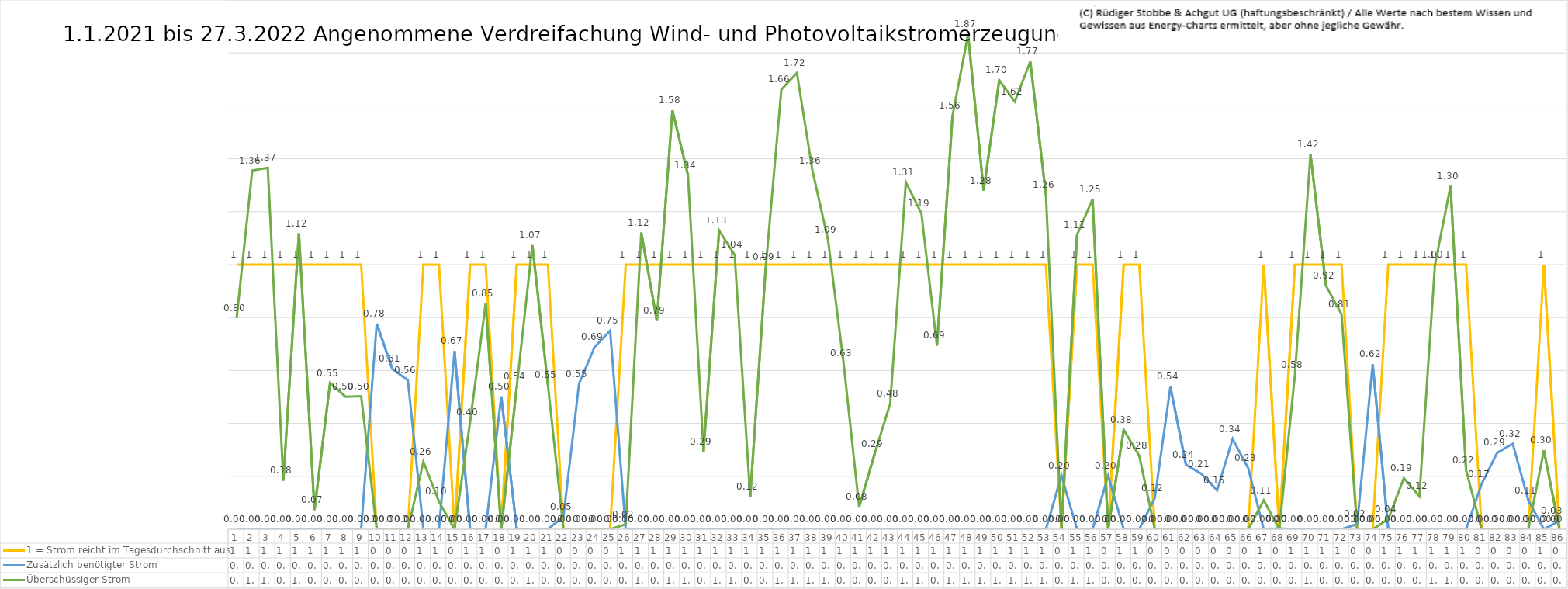
| Category | 1 = Strom reicht im Tagesdurchschnitt aus | Zusätzlich benötigter Strom | Überschüssiger Strom |
|---|---|---|---|
| 0 | 1 | 0 | 0.798 |
| 1 | 1 | 0 | 1.356 |
| 2 | 1 | 0 | 1.366 |
| 3 | 1 | 0 | 0.184 |
| 4 | 1 | 0 | 1.118 |
| 5 | 1 | 0 | 0.073 |
| 6 | 1 | 0 | 0.553 |
| 7 | 1 | 0 | 0.501 |
| 8 | 1 | 0 | 0.503 |
| 9 | 0 | 0.777 | 0 |
| 10 | 0 | 0.606 | 0 |
| 11 | 0 | 0.563 | 0 |
| 12 | 1 | 0 | 0.255 |
| 13 | 1 | 0 | 0.104 |
| 14 | 0 | 0.673 | 0 |
| 15 | 1 | 0 | 0.405 |
| 16 | 1 | 0 | 0.852 |
| 17 | 0 | 0.502 | 0 |
| 18 | 1 | 0 | 0.54 |
| 19 | 1 | 0 | 1.074 |
| 20 | 1 | 0 | 0.546 |
| 21 | 0 | 0.048 | 0 |
| 22 | 0 | 0.55 | 0 |
| 23 | 0 | 0.688 | 0 |
| 24 | 0 | 0.751 | 0 |
| 25 | 1 | 0 | 0.018 |
| 26 | 1 | 0 | 1.121 |
| 27 | 1 | 0 | 0.788 |
| 28 | 1 | 0 | 1.583 |
| 29 | 1 | 0 | 1.338 |
| 30 | 1 | 0 | 0.293 |
| 31 | 1 | 0 | 1.13 |
| 32 | 1 | 0 | 1.037 |
| 33 | 1 | 0 | 0.123 |
| 34 | 1 | 0 | 0.992 |
| 35 | 1 | 0 | 1.662 |
| 36 | 1 | 0 | 1.724 |
| 37 | 1 | 0 | 1.355 |
| 38 | 1 | 0 | 1.094 |
| 39 | 1 | 0 | 0.628 |
| 40 | 1 | 0 | 0.085 |
| 41 | 1 | 0 | 0.286 |
| 42 | 1 | 0 | 0.476 |
| 43 | 1 | 0 | 1.311 |
| 44 | 1 | 0 | 1.194 |
| 45 | 1 | 0 | 0.694 |
| 46 | 1 | 0 | 1.563 |
| 47 | 1 | 0 | 1.87 |
| 48 | 1 | 0 | 1.28 |
| 49 | 1 | 0 | 1.697 |
| 50 | 1 | 0 | 1.616 |
| 51 | 1 | 0 | 1.767 |
| 52 | 1 | 0 | 1.264 |
| 53 | 0 | 0.202 | 0 |
| 54 | 1 | 0 | 1.112 |
| 55 | 1 | 0 | 1.247 |
| 56 | 0 | 0.202 | 0 |
| 57 | 1 | 0 | 0.376 |
| 58 | 1 | 0 | 0.278 |
| 59 | 0 | 0.118 | 0 |
| 60 | 0 | 0.538 | 0 |
| 61 | 0 | 0.244 | 0 |
| 62 | 0 | 0.209 | 0 |
| 63 | 0 | 0.147 | 0 |
| 64 | 0 | 0.341 | 0 |
| 65 | 0 | 0.231 | 0 |
| 66 | 1 | 0 | 0.11 |
| 67 | 0 | 0.003 | 0 |
| 68 | 1 | 0 | 0.584 |
| 69 | 1 | 0 | 1.417 |
| 70 | 1 | 0 | 0.92 |
| 71 | 1 | 0 | 0.813 |
| 72 | 0 | 0.019 | 0 |
| 73 | 0 | 0.624 | 0 |
| 74 | 1 | 0 | 0.038 |
| 75 | 1 | 0 | 0.193 |
| 76 | 1 | 0 | 0.125 |
| 77 | 1 | 0 | 0.999 |
| 78 | 1 | 0 | 1.297 |
| 79 | 1 | 0 | 0.224 |
| 80 | 0 | 0.171 | 0 |
| 81 | 0 | 0.289 | 0 |
| 82 | 0 | 0.323 | 0 |
| 83 | 0 | 0.11 | 0 |
| 84 | 1 | 0 | 0.298 |
| 85 | 0 | 0.032 | 0 |